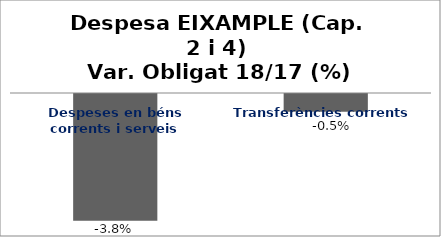
| Category | Series 0 |
|---|---|
| Despeses en béns corrents i serveis | -0.038 |
| Transferències corrents | -0.005 |